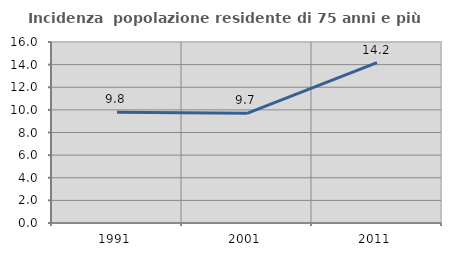
| Category | Incidenza  popolazione residente di 75 anni e più |
|---|---|
| 1991.0 | 9.78 |
| 2001.0 | 9.692 |
| 2011.0 | 14.168 |